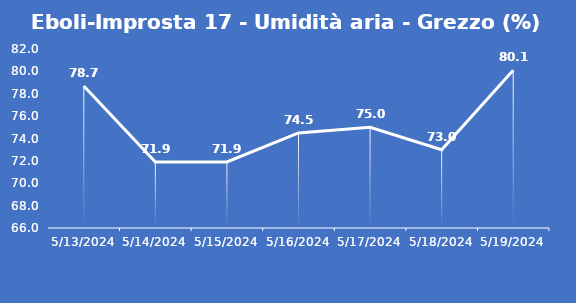
| Category | Eboli-Improsta 17 - Umidità aria - Grezzo (%) |
|---|---|
| 5/13/24 | 78.7 |
| 5/14/24 | 71.9 |
| 5/15/24 | 71.9 |
| 5/16/24 | 74.5 |
| 5/17/24 | 75 |
| 5/18/24 | 73 |
| 5/19/24 | 80.1 |